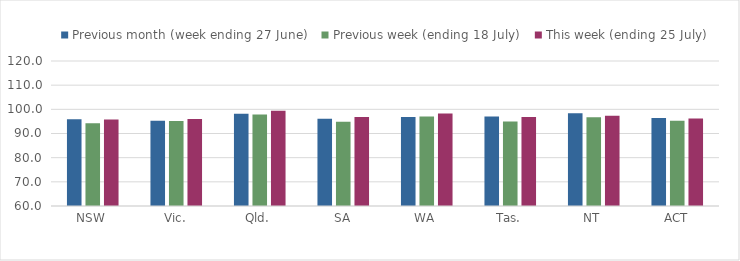
| Category | Previous month (week ending 27 June) | Previous week (ending 18 July) | This week (ending 25 July) |
|---|---|---|---|
| NSW | 95.918 | 94.191 | 95.75 |
| Vic. | 95.236 | 95.212 | 95.982 |
| Qld. | 98.211 | 97.906 | 99.415 |
| SA | 96.149 | 94.911 | 96.855 |
| WA | 96.779 | 97.007 | 98.28 |
| Tas. | 97.023 | 94.968 | 96.788 |
| NT | 98.347 | 96.771 | 97.362 |
| ACT | 96.462 | 95.265 | 96.232 |